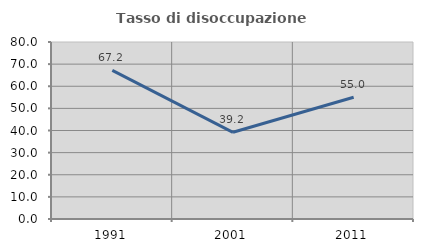
| Category | Tasso di disoccupazione giovanile  |
|---|---|
| 1991.0 | 67.157 |
| 2001.0 | 39.189 |
| 2011.0 | 55 |